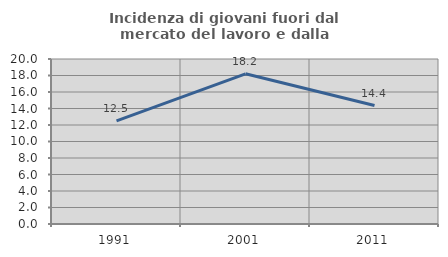
| Category | Incidenza di giovani fuori dal mercato del lavoro e dalla formazione  |
|---|---|
| 1991.0 | 12.5 |
| 2001.0 | 18.204 |
| 2011.0 | 14.363 |